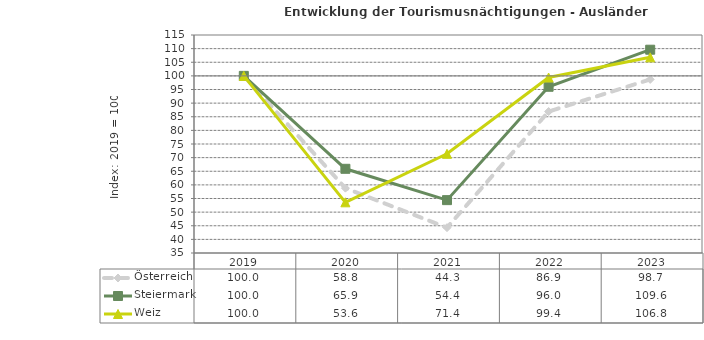
| Category | Österreich | Steiermark | Weiz |
|---|---|---|---|
| 2023.0 | 98.7 | 109.6 | 106.8 |
| 2022.0 | 86.9 | 96 | 99.4 |
| 2021.0 | 44.3 | 54.4 | 71.4 |
| 2020.0 | 58.8 | 65.9 | 53.6 |
| 2019.0 | 100 | 100 | 100 |